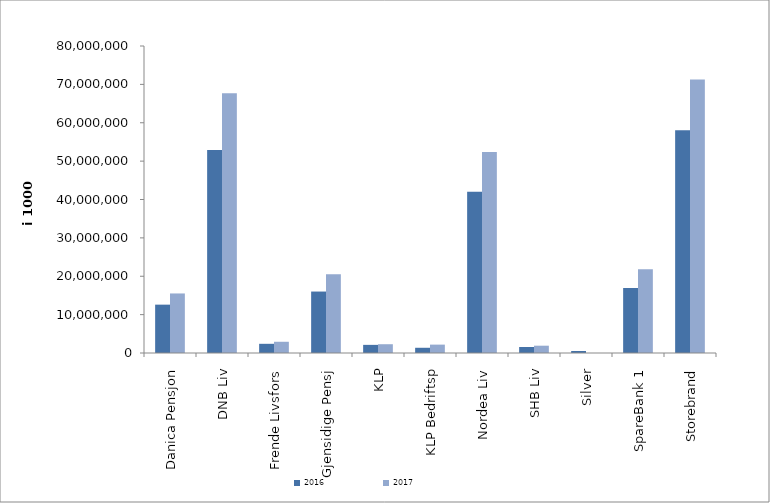
| Category | 2016 | 2017 |
|---|---|---|
| 0 | 12599531.245 | 15516241.074 |
| 1 | 52892825 | 67680359 |
| 2 | 2394875 | 2925269 |
| 3 | 16013492.852 | 20522578 |
| 4 | 2120218.962 | 2288839.257 |
| 5 | 1361843 | 2183015 |
| 6 | 42006581.1 | 52390620 |
| 7 | 1571024 | 1903610 |
| 8 | 515694.203 | 0 |
| 9 | 16928884.255 | 21802567.12 |
| 10 | 58026529.603 | 71261439.237 |